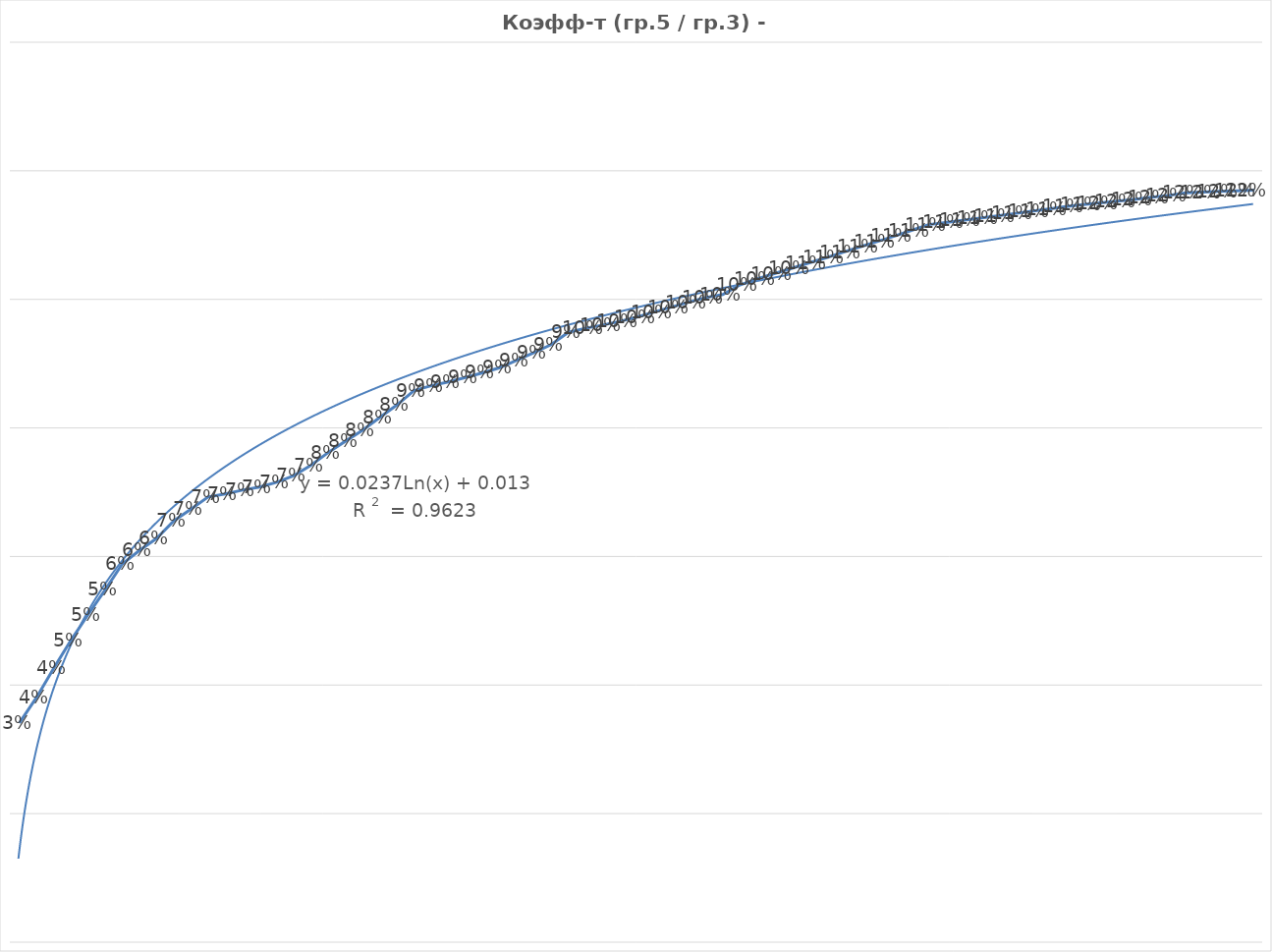
| Category | Series 0 |
|---|---|
| 0 | 0.034 |
| 1 | 0.038 |
| 2 | 0.043 |
| 3 | 0.047 |
| 4 | 0.051 |
| 5 | 0.055 |
| 6 | 0.059 |
| 7 | 0.061 |
| 8 | 0.063 |
| 9 | 0.066 |
| 10 | 0.067 |
| 11 | 0.069 |
| 12 | 0.07 |
| 13 | 0.07 |
| 14 | 0.071 |
| 15 | 0.072 |
| 16 | 0.073 |
| 17 | 0.074 |
| 18 | 0.076 |
| 19 | 0.078 |
| 20 | 0.08 |
| 21 | 0.082 |
| 22 | 0.084 |
| 23 | 0.086 |
| 24 | 0.087 |
| 25 | 0.087 |
| 26 | 0.088 |
| 27 | 0.089 |
| 28 | 0.089 |
| 29 | 0.091 |
| 30 | 0.092 |
| 31 | 0.093 |
| 32 | 0.095 |
| 33 | 0.096 |
| 34 | 0.096 |
| 35 | 0.097 |
| 36 | 0.097 |
| 37 | 0.098 |
| 38 | 0.099 |
| 39 | 0.1 |
| 40 | 0.1 |
| 41 | 0.101 |
| 42 | 0.102 |
| 43 | 0.103 |
| 44 | 0.104 |
| 45 | 0.105 |
| 46 | 0.106 |
| 47 | 0.106 |
| 48 | 0.107 |
| 49 | 0.108 |
| 50 | 0.109 |
| 51 | 0.11 |
| 52 | 0.111 |
| 53 | 0.112 |
| 54 | 0.112 |
| 55 | 0.112 |
| 56 | 0.113 |
| 57 | 0.113 |
| 58 | 0.113 |
| 59 | 0.114 |
| 60 | 0.114 |
| 61 | 0.114 |
| 62 | 0.115 |
| 63 | 0.115 |
| 64 | 0.115 |
| 65 | 0.116 |
| 66 | 0.116 |
| 67 | 0.116 |
| 68 | 0.117 |
| 69 | 0.117 |
| 70 | 0.117 |
| 71 | 0.117 |
| 72 | 0.117 |